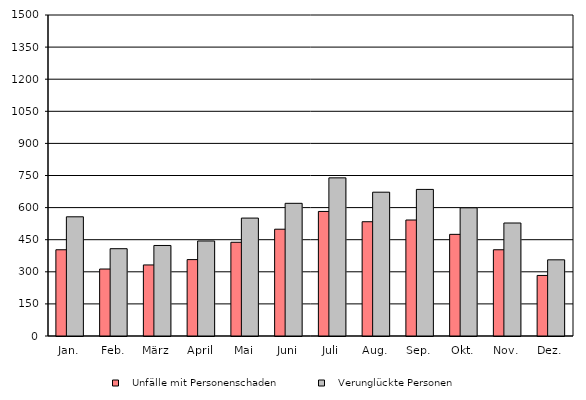
| Category |    Unfälle mit Personenschaden |    Verunglückte Personen |
|---|---|---|
| Jan. | 403 | 557 |
| Feb. | 313 | 408 |
| März | 332 | 423 |
| April | 357 | 444 |
| Mai | 438 | 551 |
| Juni | 499 | 620 |
| Juli | 582 | 739 |
| Aug. | 534 | 672 |
| Sep. | 542 | 685 |
| Okt. | 475 | 599 |
| Nov. | 403 | 528 |
| Dez. | 283 | 356 |